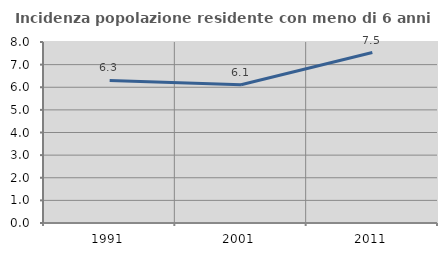
| Category | Incidenza popolazione residente con meno di 6 anni |
|---|---|
| 1991.0 | 6.299 |
| 2001.0 | 6.11 |
| 2011.0 | 7.536 |